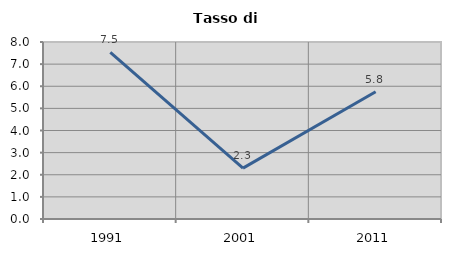
| Category | Tasso di disoccupazione   |
|---|---|
| 1991.0 | 7.531 |
| 2001.0 | 2.299 |
| 2011.0 | 5.751 |